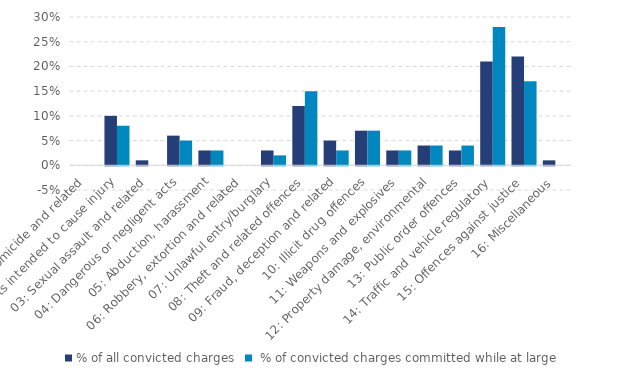
| Category | % of all convicted charges |  % of convicted charges committed while at large |
|---|---|---|
| 01: Homicide and related | 0 | 0 |
| 02: Acts intended to cause injury | 0.1 | 0.08 |
| 03: Sexual assault and related | 0.01 | 0 |
| 04: Dangerous or negligent acts | 0.06 | 0.05 |
| 05: Abduction, harassment | 0.03 | 0.03 |
| 06: Robbery, extortion and related | 0 | 0 |
| 07: Unlawful entry/burglary | 0.03 | 0.02 |
| 08: Theft and related offences | 0.12 | 0.15 |
| 09: Fraud, deception and related | 0.05 | 0.03 |
| 10: Illicit drug offences | 0.07 | 0.07 |
| 11: Weapons and explosives | 0.03 | 0.03 |
| 12: Property damage, environmental | 0.04 | 0.04 |
| 13: Public order offences | 0.03 | 0.04 |
| 14: Traffic and vehicle regulatory | 0.21 | 0.28 |
| 15: Offences against justice | 0.22 | 0.17 |
| 16: Miscellaneous | 0.01 | 0 |